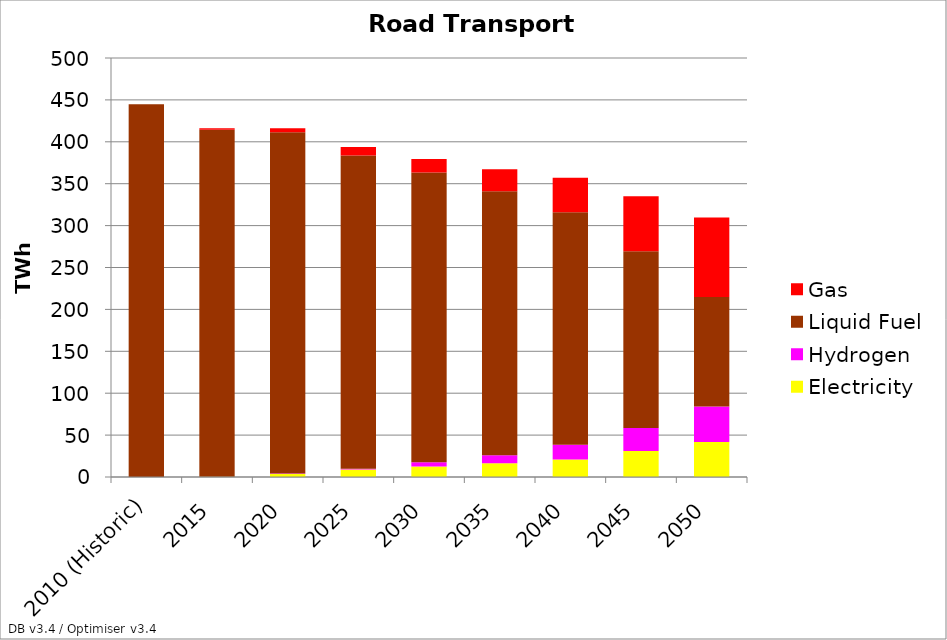
| Category | Electricity | Hydrogen | Liquid Fuel | Gas |
|---|---|---|---|---|
| 2010 (Historic) | 0 | 0 | 444.8 | 0 |
| 2015 | 0.271 | 0 | 414.021 | 1.856 |
| 2020 | 3.647 | 0.55 | 407.111 | 4.999 |
| 2025 | 8.9 | 1.056 | 373.572 | 10.309 |
| 2030 | 12.459 | 5.159 | 345.652 | 16.264 |
| 2035 | 16.39 | 9.666 | 314.804 | 26.294 |
| 2040 | 21.032 | 17.449 | 277.348 | 41.235 |
| 2045 | 31.047 | 27.318 | 210.899 | 65.772 |
| 2050 | 41.898 | 42.273 | 130.631 | 94.809 |